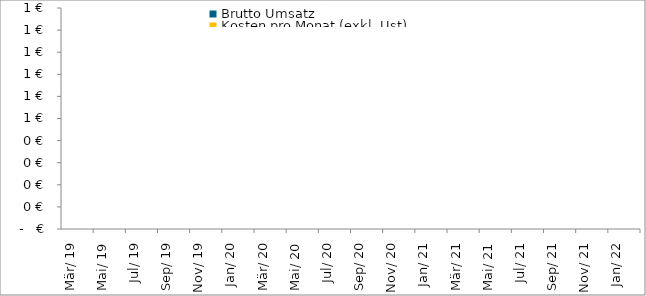
| Category | Brutto Umsatz | Kosten pro Monat (exkl. Ust) | Gewinn / Verlust (mit Abschreibungen) |
|---|---|---|---|
| 2019-03-01 | 0 | 0 | 0 |
| 2019-04-01 | 0 | 0 | 0 |
| 2019-05-01 | 0 | 0 | 0 |
| 2019-06-01 | 0 | 0 | 0 |
| 2019-07-01 | 0 | 0 | 0 |
| 2019-08-01 | 0 | 0 | 0 |
| 2019-09-01 | 0 | 0 | 0 |
| 2019-10-01 | 0 | 0 | 0 |
| 2019-11-01 | 0 | 0 | 0 |
| 2019-12-01 | 0 | 0 | 0 |
| 2020-01-01 | 0 | 0 | 0 |
| 2020-02-01 | 0 | 0 | 0 |
| 2020-03-01 | 0 | 0 | 0 |
| 2020-04-01 | 0 | 0 | 0 |
| 2020-05-01 | 0 | 0 | 0 |
| 2020-06-01 | 0 | 0 | 0 |
| 2020-07-01 | 0 | 0 | 0 |
| 2020-08-01 | 0 | 0 | 0 |
| 2020-09-01 | 0 | 0 | 0 |
| 2020-10-01 | 0 | 0 | 0 |
| 2020-11-01 | 0 | 0 | 0 |
| 2020-12-01 | 0 | 0 | 0 |
| 2021-01-01 | 0 | 0 | 0 |
| 2021-02-01 | 0 | 0 | 0 |
| 2021-03-01 | 0 | 0 | 0 |
| 2021-04-01 | 0 | 0 | 0 |
| 2021-05-01 | 0 | 0 | 0 |
| 2021-06-01 | 0 | 0 | 0 |
| 2021-07-01 | 0 | 0 | 0 |
| 2021-08-01 | 0 | 0 | 0 |
| 2021-09-01 | 0 | 0 | 0 |
| 2021-10-01 | 0 | 0 | 0 |
| 2021-11-01 | 0 | 0 | 0 |
| 2021-12-01 | 0 | 0 | 0 |
| 2022-01-01 | 0 | 0 | 0 |
| 2022-02-01 | 0 | 0 | 0 |